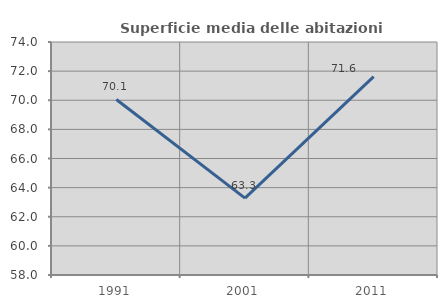
| Category | Superficie media delle abitazioni occupate |
|---|---|
| 1991.0 | 70.054 |
| 2001.0 | 63.276 |
| 2011.0 | 71.618 |